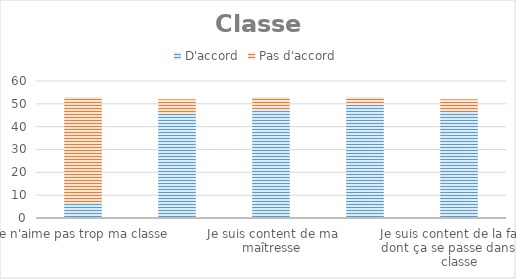
| Category | D'accord | Pas d'accord |
|---|---|---|
| Je n'aime pas trop ma classe | 7 | 46 |
| Je suis content d'être dans ma classe | 46 | 6 |
| Je suis content de ma maîtresse | 48 | 5 |
| Je suis content de ma salle de classe | 50 | 3 |
| Je suis content de la façon dont ça se passe dans ma classe | 47 | 5 |